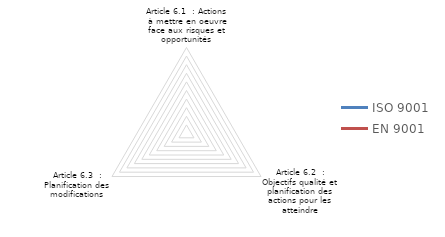
| Category | ISO 9001 | EN 9001 |
|---|---|---|
| Article 6.1  : Actions à mettre en oeuvre face aux risques et opportunités | 0 | 0 |
| Article 6.2  : Objectifs qualité et planification des actions pour les atteindre | 0 | 0 |
| Article 6.3  : Planification des modifications | 0 | 0 |